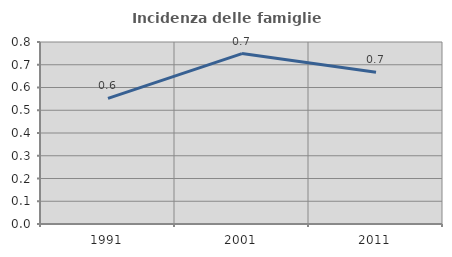
| Category | Incidenza delle famiglie numerose |
|---|---|
| 1991.0 | 0.552 |
| 2001.0 | 0.749 |
| 2011.0 | 0.667 |